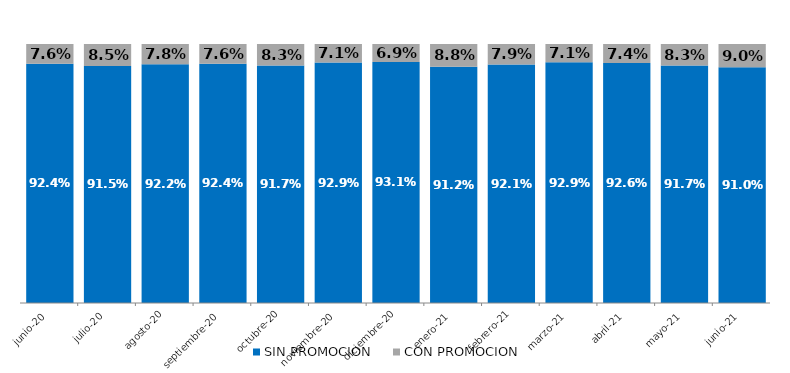
| Category | SIN PROMOCION   | CON PROMOCION   |
|---|---|---|
| 2020-06-01 | 0.924 | 0.076 |
| 2020-07-01 | 0.915 | 0.085 |
| 2020-08-01 | 0.922 | 0.078 |
| 2020-09-01 | 0.924 | 0.076 |
| 2020-10-01 | 0.917 | 0.083 |
| 2020-11-01 | 0.929 | 0.071 |
| 2020-12-01 | 0.931 | 0.069 |
| 2021-01-01 | 0.912 | 0.088 |
| 2021-02-01 | 0.921 | 0.079 |
| 2021-03-01 | 0.929 | 0.071 |
| 2021-04-01 | 0.926 | 0.074 |
| 2021-05-01 | 0.917 | 0.083 |
| 2021-06-01 | 0.91 | 0.09 |